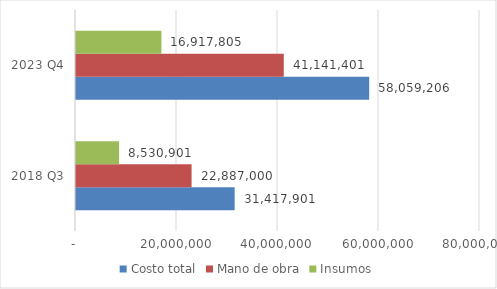
| Category | Costo total | Mano de obra | Insumos |
|---|---|---|---|
| 2018 Q3 | 31417901 | 22887000 | 8530901 |
| 2023 Q4 | 58059206.327 | 41141401 | 16917805.327 |